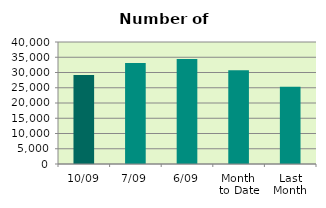
| Category | Series 0 |
|---|---|
| 10/09 | 29182 |
| 7/09 | 33098 |
| 6/09 | 34390 |
| Month 
to Date | 30751 |
| Last
Month | 25327.391 |